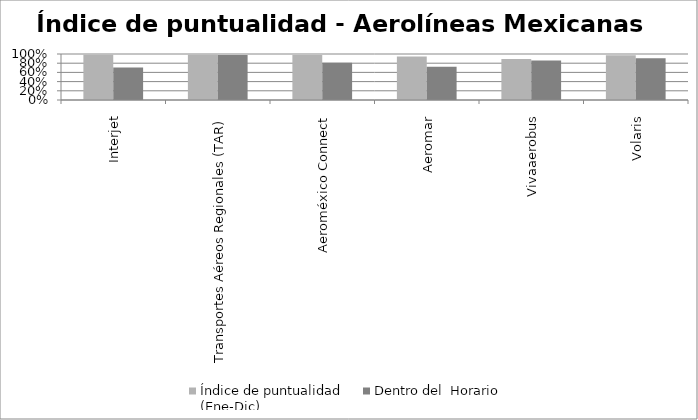
| Category | Índice de puntualidad
(Ene-Dic) | Dentro del  Horario |
|---|---|---|
| Interjet | 0.986 | 0.704 |
| Transportes Aéreos Regionales (TAR) | 0.984 | 0.981 |
| Aeroméxico Connect | 0.978 | 0.811 |
| Aeromar | 0.947 | 0.721 |
| Vivaaerobus | 0.891 | 0.857 |
| Volaris | 0.971 | 0.909 |